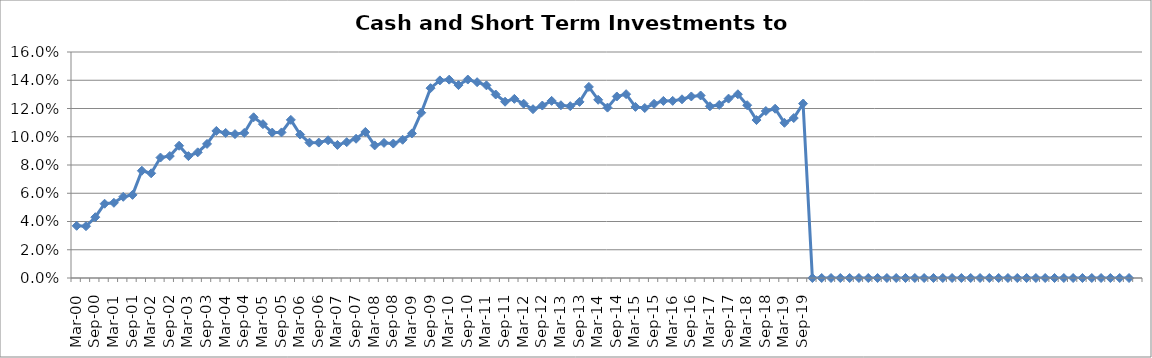
| Category | Cash and Short-Term Investments to Revenue % |
|---|---|
| Mar-00 | 0.037 |
| Jun-00 | 0.037 |
| Sep-00 | 0.043 |
| Dec-00 | 0.053 |
| Mar-01 | 0.053 |
| Jun-01 | 0.057 |
| Sep-01 | 0.059 |
| Dec-01 | 0.076 |
| Mar-02 | 0.074 |
| Jun-02 | 0.085 |
| Sep-02 | 0.086 |
| Dec-02 | 0.094 |
| Mar-03 | 0.086 |
| Jun-03 | 0.089 |
| Sep-03 | 0.095 |
| Dec-03 | 0.104 |
| Mar-04 | 0.103 |
| Jun-04 | 0.102 |
| Sep-04 | 0.103 |
| Dec-04 | 0.114 |
| Mar-05 | 0.109 |
| Jun-05 | 0.103 |
| Sep-05 | 0.103 |
| Dec-05 | 0.112 |
| Mar-06 | 0.102 |
| Jun-06 | 0.096 |
| Sep-06 | 0.096 |
| Dec-06 | 0.097 |
| Mar-07 | 0.094 |
| Jun-07 | 0.096 |
| Sep-07 | 0.099 |
| Dec-07 | 0.103 |
| Mar-08 | 0.094 |
| Jun-08 | 0.096 |
| Sep-08 | 0.095 |
| Dec-08 | 0.098 |
| Mar-09 | 0.102 |
| Jun-09 | 0.117 |
| Sep-09 | 0.134 |
| Dec-09 | 0.14 |
| Mar-10 | 0.14 |
| Jun-10 | 0.137 |
| Sep-10 | 0.14 |
| Dec-10 | 0.139 |
| Mar-11 | 0.136 |
| Jun-11 | 0.13 |
| Sep-11 | 0.125 |
| Dec-11 | 0.127 |
| Mar-12 | 0.123 |
| Jun-12 | 0.12 |
| Sep-12 | 0.122 |
| Dec-12 | 0.125 |
| Mar-13 | 0.122 |
| Jun-13 | 0.122 |
| Sep-13 | 0.125 |
| Dec-13 | 0.135 |
| Mar-14 | 0.126 |
| Jun-14 | 0.121 |
| Sep-14 | 0.129 |
| Dec-14 | 0.13 |
| Mar-15 | 0.121 |
| Jun-15 | 0.12 |
| Sep-15 | 0.123 |
| Dec-15 | 0.125 |
| Mar-16 | 0.125 |
| Jun-16 | 0.127 |
| Sep-16 | 0.129 |
| Dec-16 | 0.129 |
| Mar-17 | 0.122 |
| Jun-17 | 0.123 |
| Sep-17 | 0.127 |
| Dec-17 | 0.13 |
| Mar-18 | 0.122 |
| Jun-18 | 0.112 |
| Sep-18 | 0.118 |
| Dec-18 | 0.12 |
| Mar-19 | 0.11 |
| Jun-19 | 0.113 |
| Sep-19 | 0.123 |